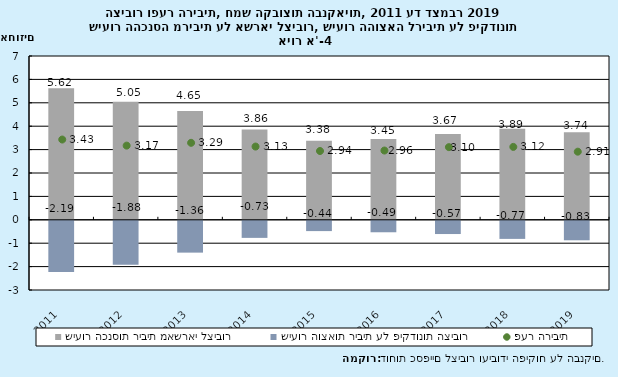
| Category | שיעור הכנסות ריבית מאשראי לציבור | שיעור הוצאות ריבית על פיקדונות הציבור |
|---|---|---|
| 2011.0 | 5.62 | -2.19 |
| 2012.0 | 5.05 | -1.88 |
| 2013.0 | 4.65 | -1.36 |
| 2014.0 | 3.86 | -0.73 |
| 2015.0 | 3.38 | -0.44 |
| 2016.0 | 3.45 | -0.49 |
| 2017.0 | 3.67 | -0.566 |
| 2018.0 | 3.889 | -0.773 |
| 2019.0 | 3.744 | -0.833 |